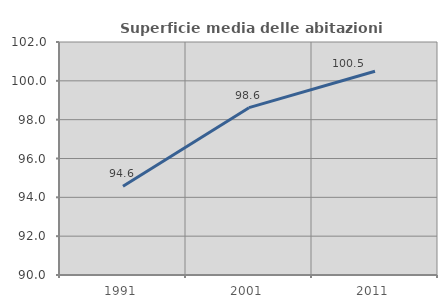
| Category | Superficie media delle abitazioni occupate |
|---|---|
| 1991.0 | 94.566 |
| 2001.0 | 98.617 |
| 2011.0 | 100.491 |